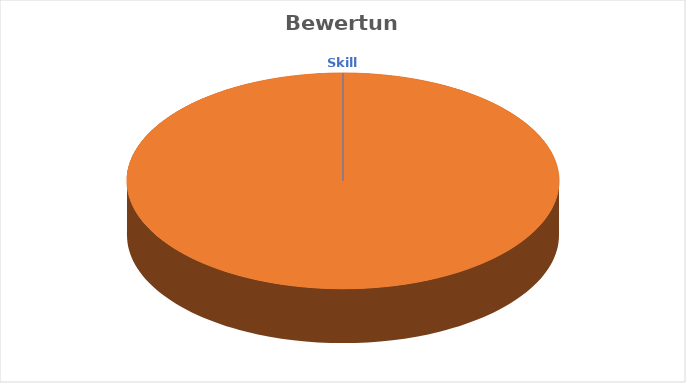
| Category | Bewertung |
|---|---|
| .NET Core | 5 |
| .NET Framework | 5 |
| ASP.NET | 6 |
| Azure Functions | 4 |
| Azure Search | 4 |
| Azure SQL | 4 |
| Azure Storage | 4 |
| Azure WebJobs | 4 |
| C#.NET | 6 |
| CSS | 6 |
| DI | 4 |
| HTML | 6 |
| JavaScript | 6 |
| jQuery | 5 |
| JSON | 5 |
| LESS | 4 |
| LINQ | 4 |
| MQTT | 4 |
| MVC | 5 |
| OOP | 5 |
| REST | 6 |
| Scrum | 4 |
| SignalR | 4 |
| SOA | 5 |
| SQL | 6 |
| SQL Server | 4 |
| XML | 4 |